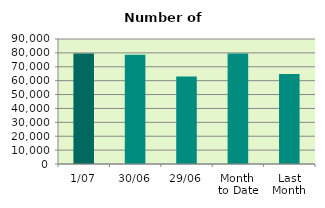
| Category | Series 0 |
|---|---|
| 1/07 | 79640 |
| 30/06 | 78626 |
| 29/06 | 63064 |
| Month 
to Date | 79640 |
| Last
Month | 64737.364 |